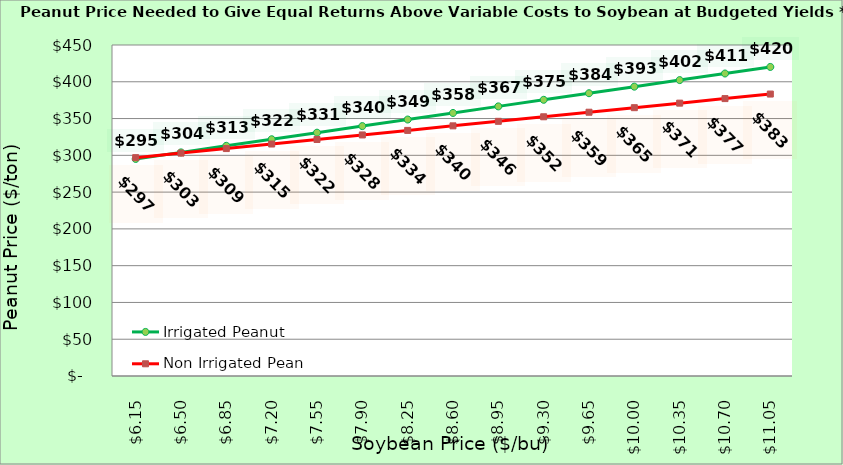
| Category | Irrigated Peanut | Non Irrigated Peanut |
|---|---|---|
| 6.150000000000002 | 295.066 | 296.837 |
| 6.500000000000002 | 304.003 | 303.013 |
| 6.850000000000001 | 312.939 | 309.19 |
| 7.200000000000001 | 321.875 | 315.366 |
| 7.550000000000001 | 330.811 | 321.543 |
| 7.9 | 339.747 | 327.719 |
| 8.25 | 348.684 | 333.895 |
| 8.6 | 357.62 | 340.072 |
| 8.95 | 366.556 | 346.248 |
| 9.299999999999999 | 375.492 | 352.425 |
| 9.649999999999999 | 384.428 | 358.601 |
| 9.999999999999998 | 393.364 | 364.778 |
| 10.349999999999998 | 402.301 | 370.954 |
| 10.699999999999998 | 411.237 | 377.131 |
| 11.049999999999997 | 420.173 | 383.307 |